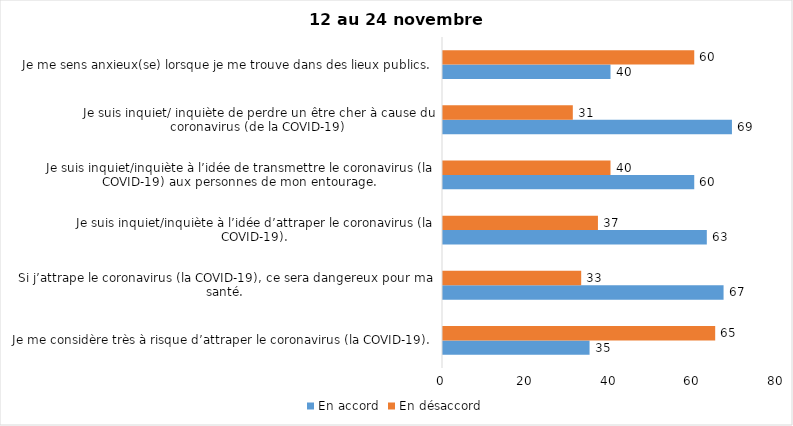
| Category | En accord | En désaccord |
|---|---|---|
| Je me considère très à risque d’attraper le coronavirus (la COVID-19). | 35 | 65 |
| Si j’attrape le coronavirus (la COVID-19), ce sera dangereux pour ma santé. | 67 | 33 |
| Je suis inquiet/inquiète à l’idée d’attraper le coronavirus (la COVID-19). | 63 | 37 |
| Je suis inquiet/inquiète à l’idée de transmettre le coronavirus (la COVID-19) aux personnes de mon entourage. | 60 | 40 |
| Je suis inquiet/ inquiète de perdre un être cher à cause du coronavirus (de la COVID-19) | 69 | 31 |
| Je me sens anxieux(se) lorsque je me trouve dans des lieux publics. | 40 | 60 |